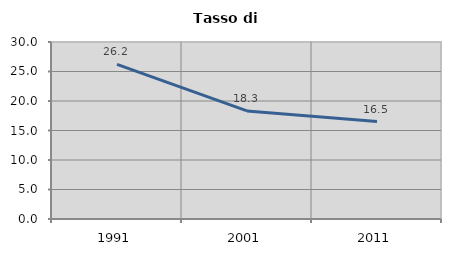
| Category | Tasso di disoccupazione   |
|---|---|
| 1991.0 | 26.198 |
| 2001.0 | 18.315 |
| 2011.0 | 16.525 |